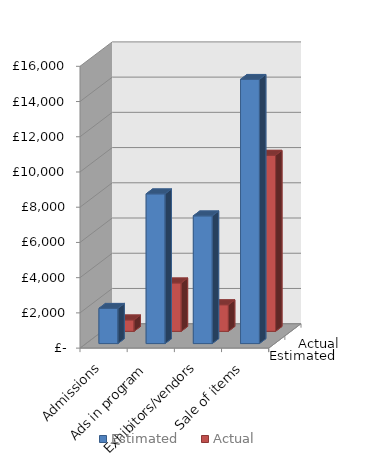
| Category | Estimated | Actual |
|---|---|---|
| Admissions | 2000 | 650 |
|  Ads in program  | 8500 | 2750 |
| Exhibitors/vendors | 7250 | 1510 |
|  Sale of items  | 15000 | 10000 |